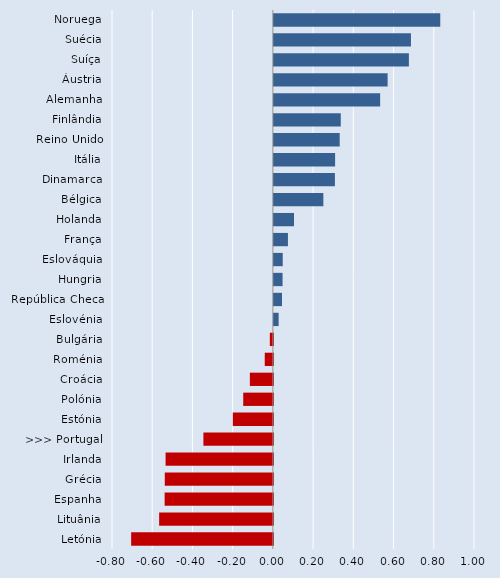
| Category | Series 0 |
|---|---|
| Noruega | 0.827 |
| Suécia | 0.682 |
| Suíça | 0.671 |
| Áustria | 0.565 |
| Alemanha | 0.528 |
| Finlândia | 0.333 |
| Reino Unido | 0.327 |
| Itália | 0.304 |
| Dinamarca | 0.303 |
| Bélgica | 0.246 |
| Holanda | 0.1 |
| França | 0.07 |
| Eslováquia | 0.044 |
| Hungria | 0.043 |
| República Checa | 0.04 |
| Eslovénia | 0.024 |
| Bulgária | -0.015 |
| Roménia | -0.041 |
| Croácia | -0.115 |
| Polónia | -0.147 |
| Estónia | -0.199 |
| >>> Portugal | -0.345 |
| Irlanda | -0.534 |
| Grécia | -0.538 |
| Espanha | -0.538 |
| Lituânia | -0.566 |
| Letónia | -0.705 |